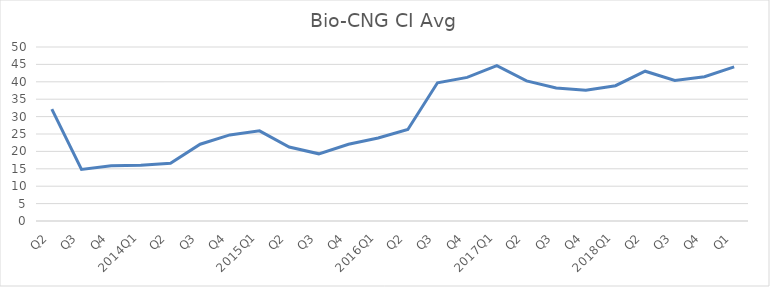
| Category | Bio-CNG CI Avg |
|---|---|
| Q2 | 32.15 |
| Q3 | 14.82 |
| Q4 | 15.85 |
| 2014Q1 | 15.99 |
| Q2 | 16.58 |
| Q3 | 22.07 |
| Q4 | 24.73 |
| 2015Q1 | 25.91 |
| Q2 | 21.26 |
| Q3 | 19.3 |
| Q4 | 22.06 |
| 2016Q1 | 23.84 |
| Q2 | 26.3 |
| Q3 | 39.71 |
| Q4 | 41.27 |
| 2017Q1 | 44.65 |
| Q2 | 40.27 |
| Q3 | 38.22 |
| Q4 | 37.55 |
| 2018Q1 | 38.88 |
| Q2 | 43.04 |
| Q3 | 40.39 |
| Q4 | 41.44 |
| Q1 | 44.27 |